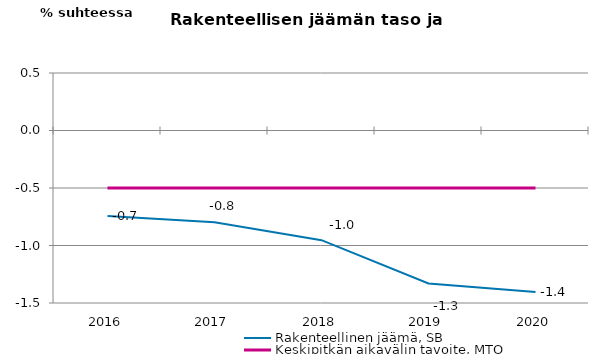
| Category | Rakenteellinen jäämä, SB | Keskipitkän aikavälin tavoite, MTO |
|---|---|---|
| 2016.0 | -0.743 | -0.5 |
| 2017.0 | -0.798 | -0.5 |
| 2018.0 | -0.954 | -0.5 |
| 2019.0 | -1.33 | -0.5 |
| 2020.0 | -1.404 | -0.5 |